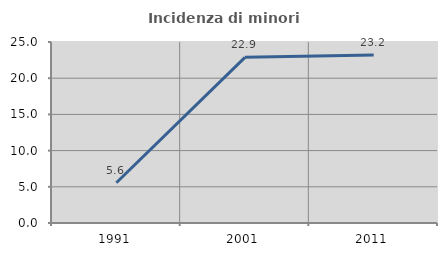
| Category | Incidenza di minori stranieri |
|---|---|
| 1991.0 | 5.556 |
| 2001.0 | 22.881 |
| 2011.0 | 23.198 |